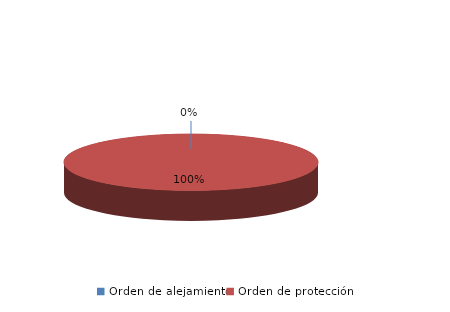
| Category | Series 0 |
|---|---|
| Orden de alejamiento | 0 |
| Orden de protección | 110 |